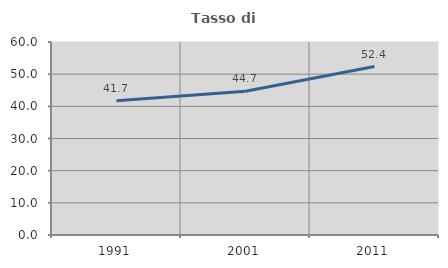
| Category | Tasso di occupazione   |
|---|---|
| 1991.0 | 41.745 |
| 2001.0 | 44.706 |
| 2011.0 | 52.37 |